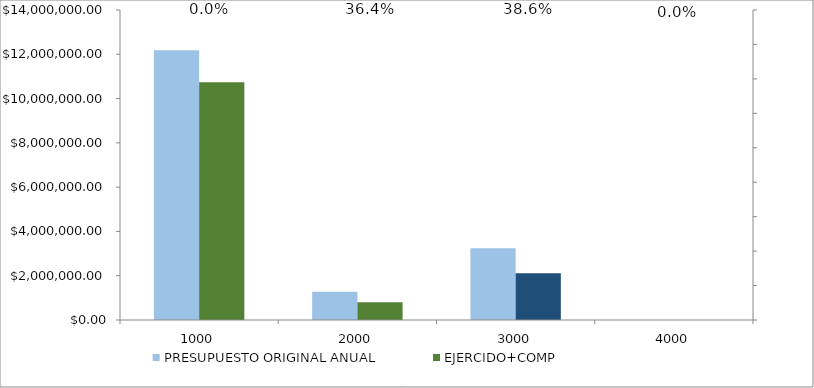
| Category | PRESUPUESTO ORIGINAL ANUAL | EJERCIDO+COMP |
|---|---|---|
| 1000.0 | 12182107 | 10733333.81 |
| 2000.0 | 1270917 | 799491.15 |
| 3000.0 | 3236942 | 2110650.62 |
| 4000.0 | 0 | 0 |